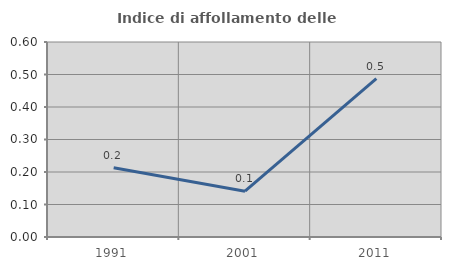
| Category | Indice di affollamento delle abitazioni  |
|---|---|
| 1991.0 | 0.213 |
| 2001.0 | 0.141 |
| 2011.0 | 0.487 |